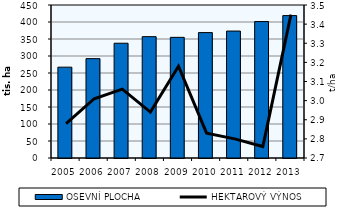
| Category | OSEVNÍ PLOCHA |
|---|---|
| 2005.0 | 267160 |
| 2006.0 | 292246 |
| 2007.0 | 337570 |
| 2008.0 | 356924 |
| 2009.0 | 354825.67 |
| 2010.0 | 368824 |
| 2011.0 | 373385.86 |
| 2012.0 | 401319.14 |
| 2013.0 | 418808.09 |